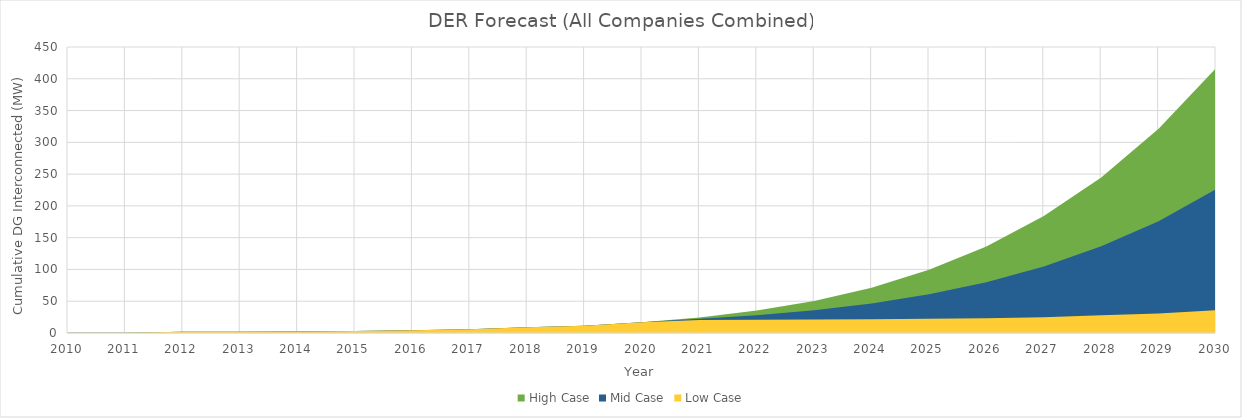
| Category | High Case | Mid Case | Low Case |
|---|---|---|---|
| 2010.0 | 0.25 | 0.25 | 0.25 |
| 2011.0 | 0.41 | 0.41 | 0.41 |
| 2012.0 | 1.776 | 1.776 | 1.776 |
| 2013.0 | 2.052 | 2.052 | 2.052 |
| 2014.0 | 2.507 | 2.507 | 2.507 |
| 2015.0 | 3.342 | 3.342 | 3.342 |
| 2016.0 | 4.238 | 4.238 | 4.238 |
| 2017.0 | 5.964 | 5.964 | 5.964 |
| 2018.0 | 8.998 | 8.998 | 8.998 |
| 2019.0 | 11.501 | 11.501 | 11.501 |
| 2020.0 | 16.751 | 16.751 | 16.751 |
| 2021.0 | 24.42 | 22.503 | 20.586 |
| 2022.0 | 35.281 | 28.028 | 20.775 |
| 2023.0 | 50.504 | 35.778 | 21.051 |
| 2024.0 | 71.362 | 46.434 | 21.506 |
| 2025.0 | 99.353 | 60.847 | 22.341 |
| 2026.0 | 136.216 | 79.726 | 23.237 |
| 2027.0 | 183.953 | 104.458 | 24.963 |
| 2028.0 | 244.844 | 136.42 | 27.997 |
| 2029.0 | 321.465 | 175.982 | 30.5 |
| 2030.0 | 416.707 | 226.229 | 35.75 |